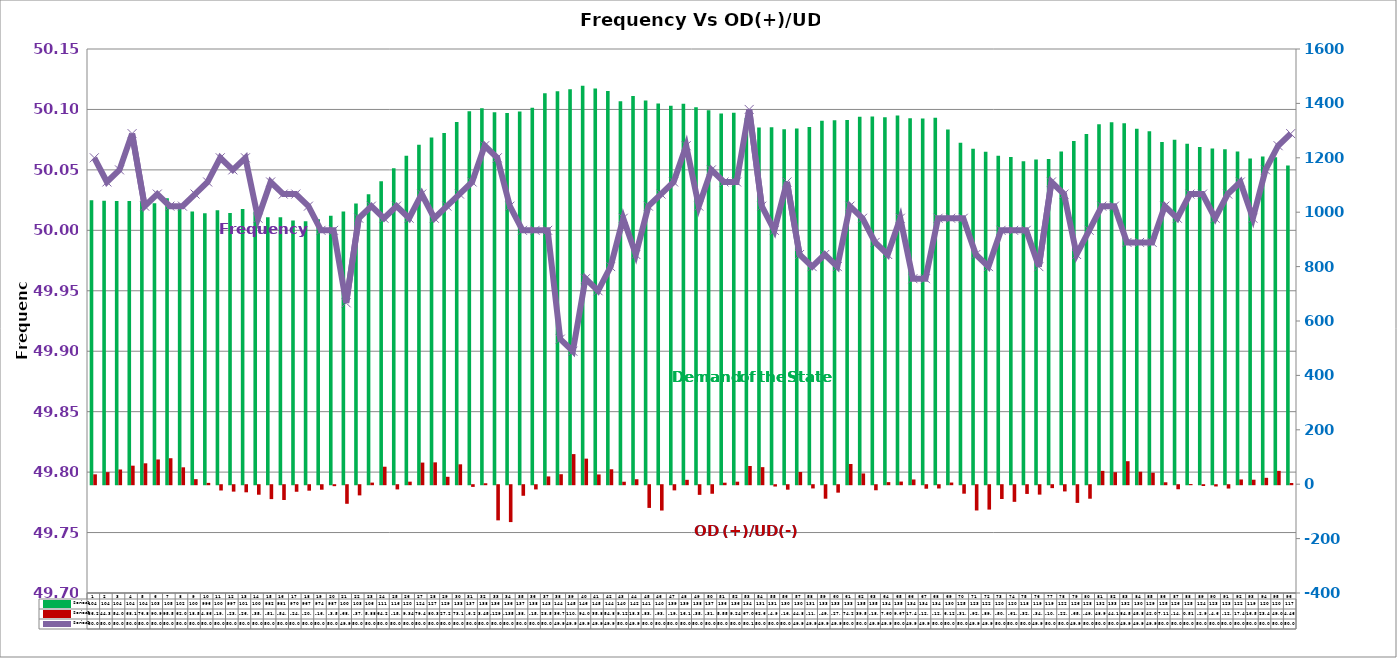
| Category | Series 2 | Series 4 |
|---|---|---|
| 0 | 1043.99 | 36.25 |
| 1 | 1042.35 | 44.32 |
| 2 | 1041.14 | 54.08 |
| 3 | 1041.51 | 68.11 |
| 4 | 1040 | 76.8 |
| 5 | 1033.18 | 90.98 |
| 6 | 1051.7 | 95.52 |
| 7 | 1019.78 | 62.09 |
| 8 | 1002.4 | 18.55 |
| 9 | 996.21 | 4.86 |
| 10 | 1007.01 | -19.46 |
| 11 | 997.39 | -23.59 |
| 12 | 1011.76 | -26.15 |
| 13 | 1001.59 | -35.04 |
| 14 | 981.87 | -51.16 |
| 15 | 981.19 | -54.35 |
| 16 | 969.66 | -24.13 |
| 17 | 966.57 | -20.16 |
| 18 | 974.2 | -16.59 |
| 19 | 986.91 | -3.54 |
| 20 | 1002.41 | -68.34 |
| 21 | 1031.8 | -37.46 |
| 22 | 1065.83 | 5.88 |
| 23 | 1114.16 | 64.28 |
| 24 | 1161.66 | -15.5 |
| 25 | 1207.32 | 9.34 |
| 26 | 1248.24 | 79.49 |
| 27 | 1274.22 | 80.32 |
| 28 | 1290.85 | 27.27 |
| 29 | 1331.69 | 73.14 |
| 30 | 1370.84 | -6.23 |
| 31 | 1382.12 | 3.45 |
| 32 | 1367.03 | -129.26 |
| 33 | 1364.79 | -135.64 |
| 34 | 1370.64 | -38.88 |
| 35 | 1383.89 | -15.58 |
| 36 | 1437.59 | 28.55 |
| 37 | 1444.42 | 36.73 |
| 38 | 1452.17 | 110.65 |
| 39 | 1464.65 | 94 |
| 40 | 1455.14 | 35.89 |
| 41 | 1445.77 | 54.88 |
| 42 | 1407.69 | 9.12 |
| 43 | 1427.23 | 18.32 |
| 44 | 1410.38 | -83.51 |
| 45 | 1399.83 | -93.11 |
| 46 | 1390.95 | -19.05 |
| 47 | 1399.16 | 16.1 |
| 48 | 1385.53 | -35.55 |
| 49 | 1375.1 | -31.45 |
| 50 | 1363.13 | 5.55 |
| 51 | 1365.69 | 9.24 |
| 52 | 1346.24 | 67 |
| 53 | 1311.49 | 62.69 |
| 54 | 1312.47 | -4.91 |
| 55 | 1305.17 | -16.46 |
| 56 | 1308 | 44.87 |
| 57 | 1313.42 | -11.9 |
| 58 | 1336.49 | -49.66 |
| 59 | 1337.87 | -27.41 |
| 60 | 1338.65 | 74.2 |
| 61 | 1351.02 | 39.53 |
| 62 | 1351.39 | -18.65 |
| 63 | 1349.13 | 7.6 |
| 64 | 1355.95 | 9.67 |
| 65 | 1345.79 | 17.4 |
| 66 | 1344.45 | -12.95 |
| 67 | 1347.69 | -12.08 |
| 68 | 1304.13 | 6.12 |
| 69 | 1255.59 | -31.18 |
| 70 | 1233.46 | -92.9 |
| 71 | 1222.5 | -89.71 |
| 72 | 1207.94 | -50.82 |
| 73 | 1203.03 | -61.18 |
| 74 | 1186.93 | -32.1 |
| 75 | 1193.78 | -34.64 |
| 76 | 1195.75 | -10.79 |
| 77 | 1222.73 | -22.93 |
| 78 | 1261.4 | -65.06 |
| 79 | 1287.17 | -49.73 |
| 80 | 1323.38 | 48.98 |
| 81 | 1330.67 | 44.11 |
| 82 | 1326.96 | 84.57 |
| 83 | 1306.42 | 45.82 |
| 84 | 1297.46 | 42.08 |
| 85 | 1258.38 | 7.11 |
| 86 | 1266.78 | -14.91 |
| 87 | 1252 | 0.51 |
| 88 | 1239.54 | -2.93 |
| 89 | 1233.92 | -4.65 |
| 90 | 1231.67 | -12.25 |
| 91 | 1223.19 | 17.45 |
| 92 | 1197.71 | 16.5 |
| 93 | 1204.58 | 23.47 |
| 94 | 1201.95 | 49.02 |
| 95 | 1171.46 | 4.46 |